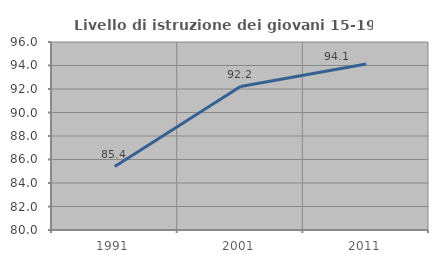
| Category | Livello di istruzione dei giovani 15-19 anni |
|---|---|
| 1991.0 | 85.401 |
| 2001.0 | 92.208 |
| 2011.0 | 94.133 |